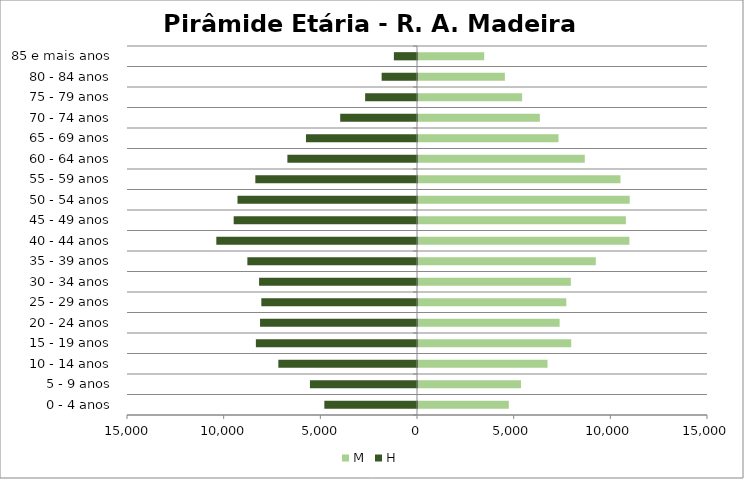
| Category | M | H |
|---|---|---|
| 0 - 4 anos | 4697 | -4793 |
| 5 - 9 anos | 5326 | -5538 |
| 10 - 14 anos | 6700 | -7172 |
| 15 - 19 anos | 7926 | -8334 |
| 20 - 24 anos | 7325 | -8118 |
| 25 - 29 anos | 7670 | -8052 |
| 30 - 34 anos | 7907 | -8168 |
| 35 - 39 anos | 9197 | -8774 |
| 40 - 44 anos | 10933 | -10380 |
| 45 - 49 anos | 10754 | -9482 |
| 50 - 54 anos | 10950 | -9285 |
| 55 - 59 anos | 10472 | -8362 |
| 60 - 64 anos | 8628 | -6704 |
| 65 - 69 anos | 7269 | -5743 |
| 70 - 74 anos | 6302 | -3973 |
| 75 - 79 anos | 5387 | -2682 |
| 80 - 84 anos | 4493 | -1829 |
| 85 e mais anos | 3424 | -1196 |